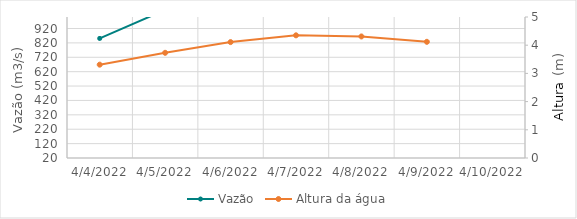
| Category | Vazão |
|---|---|
| 2/23/22 | 429.83 |
| 2/22/22 | 461.67 |
| 2/21/22 | 513.39 |
| 2/20/22 | 590.14 |
| 2/19/22 | 638.26 |
| 2/18/22 | 615.14 |
| 2/17/22 | 610.53 |